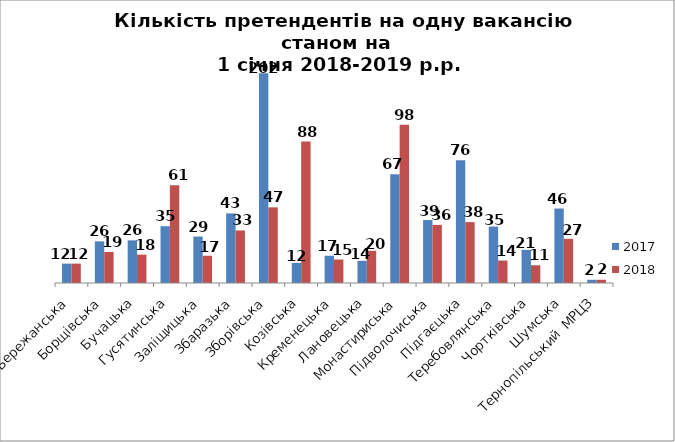
| Category | 2017 | 2018 |
|---|---|---|
| Бережанська | 12 | 12 |
| Борщівська | 25.8 | 19.188 |
| Бучацька | 26.421 | 17.594 |
| Гусятинська | 35.179 | 60.6 |
| Заліщицька | 28.769 | 16.864 |
| Збаразька | 43.111 | 32.562 |
| Зборівська | 130 | 46.857 |
| Козівська | 12.414 | 87.6 |
| Кременецька | 16.88 | 14.537 |
| Лановецька | 13.727 | 19.944 |
| Монастириська | 67.333 | 98 |
| Підволочиська | 39 | 36 |
| Підгаєцька | 76 | 37.714 |
| Теребовлянська | 34.944 | 13.927 |
| Чортківська | 20.524 | 11 |
| Шумська | 46.143 | 27.364 |
| Тернопільський  МРЦЗ | 2 | 2 |